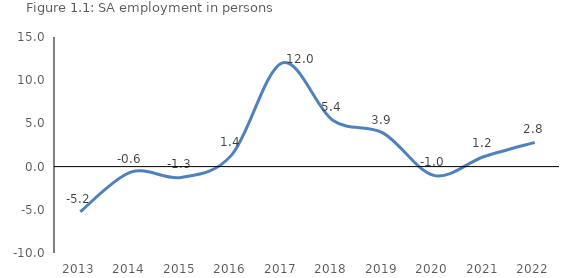
| Category | Employment SA (persons, Statistical Service) |
|---|---|
| 2013.0 | -5.23 |
| 2014.0 | -0.64 |
| 2015.0 | -1.251 |
| 2016.0 | 1.356 |
| 2017.0 | 12.007 |
| 2018.0 | 5.376 |
| 2019.0 | 3.873 |
| 2020.0 | -1.018 |
| 2021.0 | 1.17 |
| 2022.0 | 2.81 |